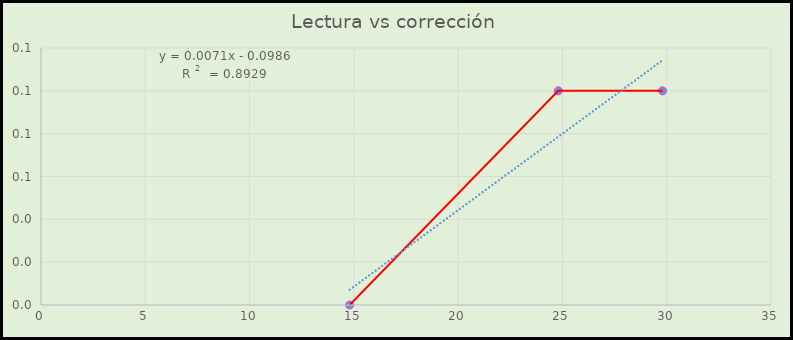
| Category | Corrección °C |
|---|---|
| 14.8 | 0 |
| 24.8 | 0.1 |
| 29.8 | 0.1 |